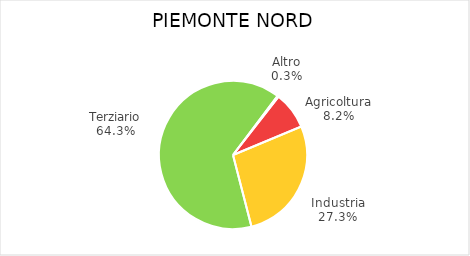
| Category | Piemonte Nord |
|---|---|
| Agricoltura | 6852 |
| Industria | 22911 |
| Terziario | 54024 |
| Altro | 225 |